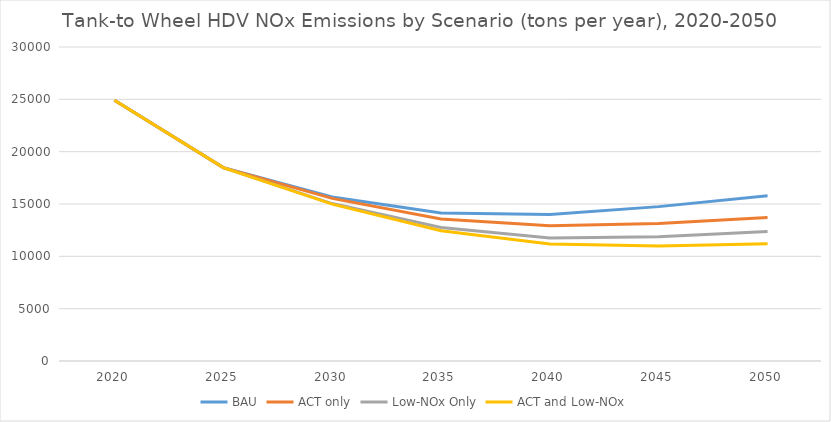
| Category | BAU | ACT only | Low-NOx Only | ACT and Low-NOx |
|---|---|---|---|---|
| 2020.0 | 24903.934 | 24903.934 | 24903.934 | 24903.934 |
| 2025.0 | 18479.77 | 18479.77 | 18479.77 | 18479.77 |
| 2030.0 | 15662.195 | 15539.612 | 15042.265 | 14989.255 |
| 2035.0 | 14145.33 | 13564.362 | 12746.799 | 12438.921 |
| 2040.0 | 13987.44 | 12910.686 | 11754.082 | 11189.467 |
| 2045.0 | 14749.518 | 13147.308 | 11862.387 | 10989.893 |
| 2050.0 | 15792.557 | 13709.433 | 12381.027 | 11210.47 |